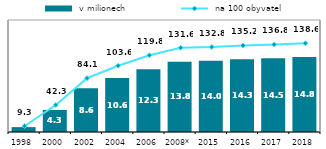
| Category |  v milionech |
|---|---|
| 1998 | 0.96 |
| 2000 | 4.338 |
| 2002 | 8.581 |
| 2004 | 10.584 |
| 2006 | 12.326 |
| 2008* | 13.78 |
| 2015 | 14.017 |
| 2016 | 14.299 |
| 2017 | 14.511 |
| 2018 | 14.756 |